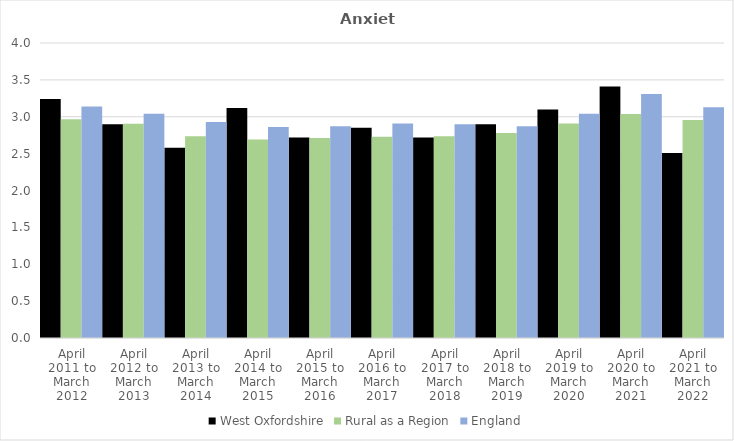
| Category | West Oxfordshire | Rural as a Region | England |
|---|---|---|---|
| April 2011 to March 2012 | 3.24 | 2.967 | 3.14 |
| April 2012 to March 2013 | 2.9 | 2.904 | 3.04 |
| April 2013 to March 2014 | 2.58 | 2.734 | 2.93 |
| April 2014 to March 2015 | 3.12 | 2.691 | 2.86 |
| April 2015 to March 2016 | 2.72 | 2.711 | 2.87 |
| April 2016 to March 2017 | 2.85 | 2.729 | 2.91 |
| April 2017 to March 2018 | 2.72 | 2.736 | 2.9 |
| April 2018 to March 2019 | 2.9 | 2.78 | 2.87 |
| April 2019 to March 2020 | 3.1 | 2.908 | 3.04 |
| April 2020 to March 2021 | 3.41 | 3.036 | 3.31 |
| April 2021 to March 2022 | 2.51 | 2.956 | 3.13 |